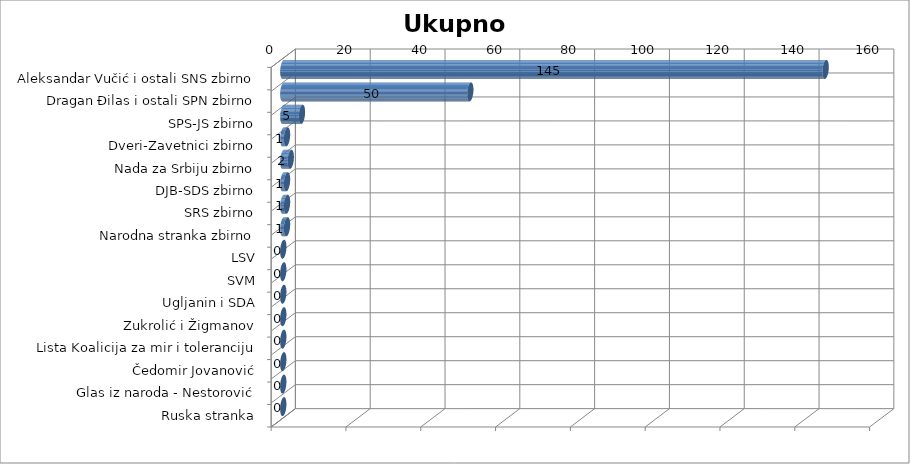
| Category | Ukupno glavna |
|---|---|
| Aleksandar Vučić i ostali SNS zbirno | 145 |
| Dragan Đilas i ostali SPN zbirno | 50 |
| SPS-JS zbirno | 5 |
| Dveri-Zavetnici zbirno | 1 |
| Nada za Srbiju zbirno | 2 |
| DJB-SDS zbirno | 1 |
| SRS zbirno | 1 |
| Narodna stranka zbirno | 1 |
| LSV | 0 |
| SVM | 0 |
| Ugljanin i SDA | 0 |
| Zukrolić i Žigmanov | 0 |
| Lista Koalicija za mir i toleranciju | 0 |
| Čedomir Jovanović | 0 |
| Glas iz naroda - Nestorović | 0 |
| Ruska stranka | 0 |